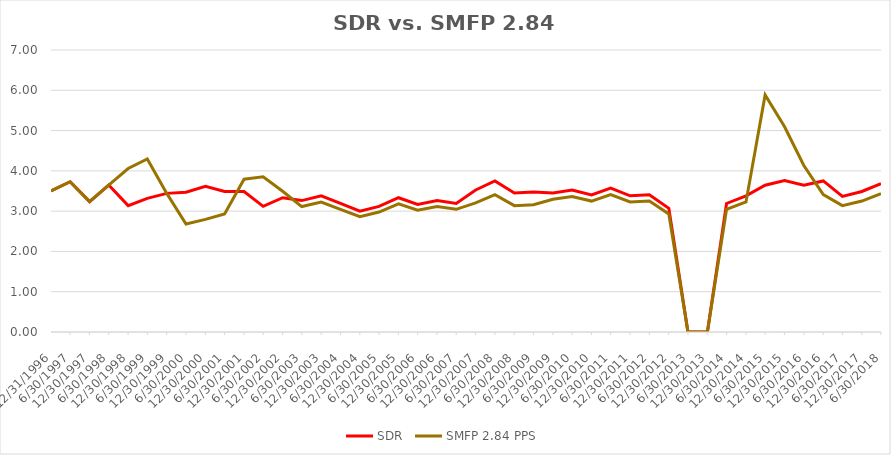
| Category | SDR | SMFP 2.84 PPS |
|---|---|---|
| 12/31/96 | 3.5 | 3.5 |
| 6/30/97 | 3.731 | 3.731 |
| 12/31/97 | 3.235 | 3.235 |
| 6/30/98 | 3.647 | 3.647 |
| 12/31/98 | 3.136 | 4.059 |
| 6/30/99 | 3.318 | 4.294 |
| 12/31/99 | 3.441 | 3.441 |
| 6/30/00 | 3.471 | 2.682 |
| 12/31/00 | 3.618 | 2.795 |
| 6/30/01 | 3.486 | 2.932 |
| 12/31/01 | 3.486 | 3.794 |
| 6/30/02 | 3.119 | 3.853 |
| 12/31/02 | 3.333 | 3.493 |
| 6/30/03 | 3.262 | 3.114 |
| 12/31/03 | 3.381 | 3.227 |
| 6/30/04 | 3.19 | 3.045 |
| 12/31/04 | 3 | 2.864 |
| 6/30/05 | 3.119 | 2.977 |
| 12/31/05 | 3.333 | 3.182 |
| 6/30/06 | 3.167 | 3.023 |
| 12/31/06 | 3.262 | 3.114 |
| 6/30/07 | 3.19 | 3.045 |
| 12/31/07 | 3.525 | 3.205 |
| 6/30/08 | 3.75 | 3.409 |
| 12/31/08 | 3.45 | 3.136 |
| 6/30/09 | 3.475 | 3.159 |
| 12/31/09 | 3.452 | 3.295 |
| 6/30/10 | 3.524 | 3.364 |
| 12/31/10 | 3.405 | 3.25 |
| 6/30/11 | 3.571 | 3.409 |
| 12/31/11 | 3.381 | 3.227 |
| 6/30/12 | 3.405 | 3.25 |
| 12/31/12 | 3.071 | 2.932 |
| 6/30/13 | 0 | 0 |
| 12/31/13 | 0 | 0 |
| 6/30/14 | 3.19 | 3.045 |
| 12/31/14 | 3.381 | 3.227 |
| 6/30/15 | 3.643 | 5.885 |
| 12/31/15 | 3.762 | 5.095 |
| 6/30/16 | 3.643 | 4.134 |
| 12/31/16 | 3.75 | 3.409 |
| 6/30/17 | 3.366 | 3.136 |
| 12/31/17 | 3.488 | 3.25 |
| 6/30/18 | 3.683 | 3.432 |